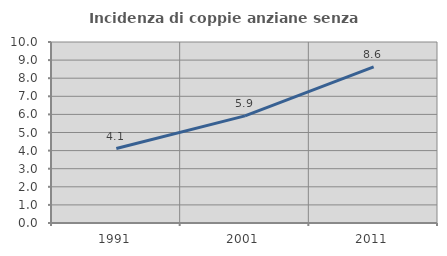
| Category | Incidenza di coppie anziane senza figli  |
|---|---|
| 1991.0 | 4.115 |
| 2001.0 | 5.919 |
| 2011.0 | 8.625 |